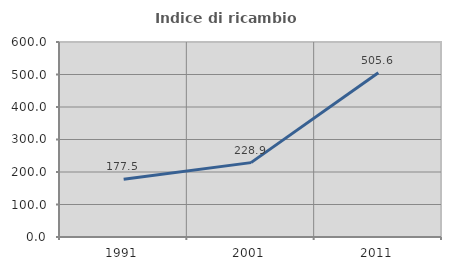
| Category | Indice di ricambio occupazionale  |
|---|---|
| 1991.0 | 177.477 |
| 2001.0 | 228.873 |
| 2011.0 | 505.634 |